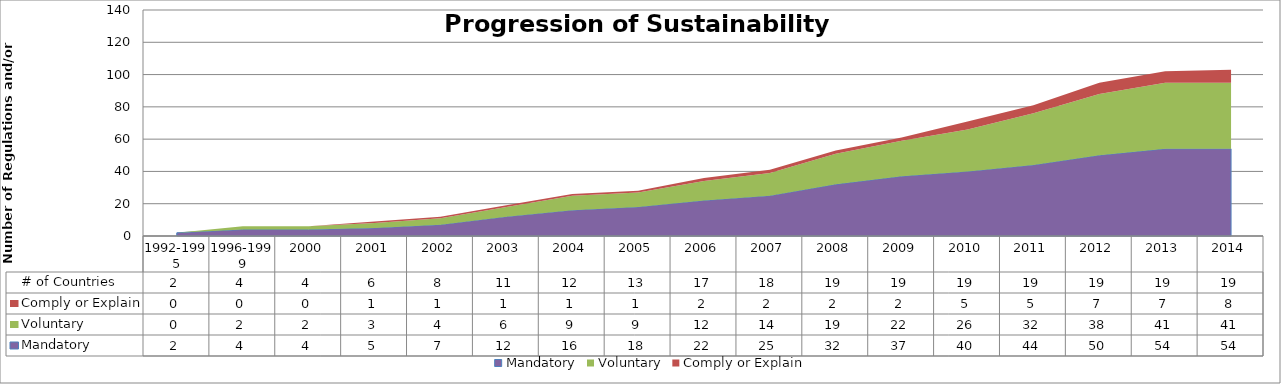
| Category | Mandatory | Voluntary | Comply or Explain | # of Countries |
|---|---|---|---|---|
| 1992-1995 | 2 | 0 | 0 | 2 |
| 1996-1999 | 4 | 2 | 0 | 4 |
| 2000 | 4 | 2 | 0 | 4 |
| 2001 | 5 | 3 | 1 | 6 |
| 2002 | 7 | 4 | 1 | 8 |
| 2003 | 12 | 6 | 1 | 11 |
| 2004 | 16 | 9 | 1 | 12 |
| 2005 | 18 | 9 | 1 | 13 |
| 2006 | 22 | 12 | 2 | 17 |
| 2007 | 25 | 14 | 2 | 18 |
| 2008 | 32 | 19 | 2 | 19 |
| 2009 | 37 | 22 | 2 | 19 |
| 2010 | 40 | 26 | 5 | 19 |
| 2011 | 44 | 32 | 5 | 19 |
| 2012 | 50 | 38 | 7 | 19 |
| 2013 | 54 | 41 | 7 | 19 |
| 2014 | 54 | 41 | 8 | 19 |